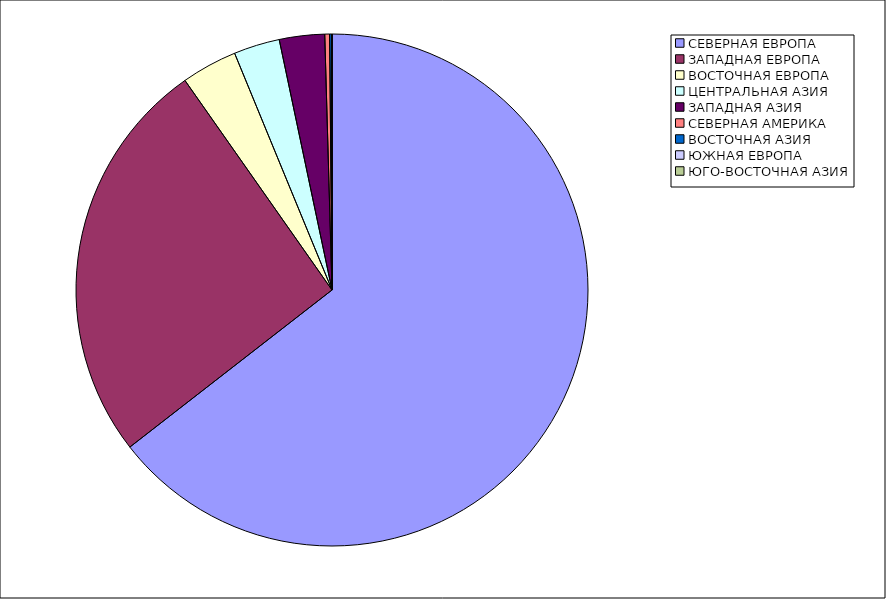
| Category | Оборот |
|---|---|
| СЕВЕРНАЯ ЕВРОПА | 64.486 |
| ЗАПАДНАЯ ЕВРОПА | 25.775 |
| ВОСТОЧНАЯ ЕВРОПА | 3.527 |
| ЦЕНТРАЛЬНАЯ АЗИЯ | 2.905 |
| ЗАПАДНАЯ АЗИЯ | 2.855 |
| СЕВЕРНАЯ АМЕРИКА | 0.303 |
| ВОСТОЧНАЯ АЗИЯ | 0.144 |
| ЮЖНАЯ ЕВРОПА | 0.005 |
| ЮГО-ВОСТОЧНАЯ АЗИЯ | 0 |